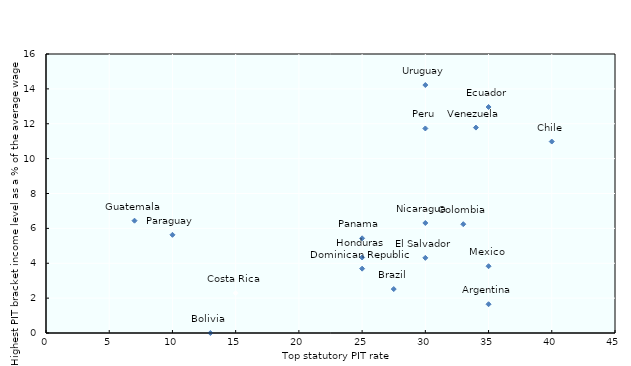
| Category | Series 0 |
|---|---|
| 7.0 | 6.44 |
| 10.0 | 5.63 |
| 13.0 | 0 |
| 15.0 | 2.29 |
| 25.0 | 4.33 |
| 25.0 | 5.43 |
| 25.0 | 3.69 |
| 27.5 | 2.52 |
| 30.0 | 4.31 |
| 30.0 | 6.31 |
| 30.0 | 11.73 |
| 30.0 | 14.22 |
| 33.0 | 6.24 |
| 34.0 | 11.78 |
| 35.0 | 3.83 |
| 35.0 | 1.65 |
| 35.0 | 12.96 |
| 40.0 | 10.98 |